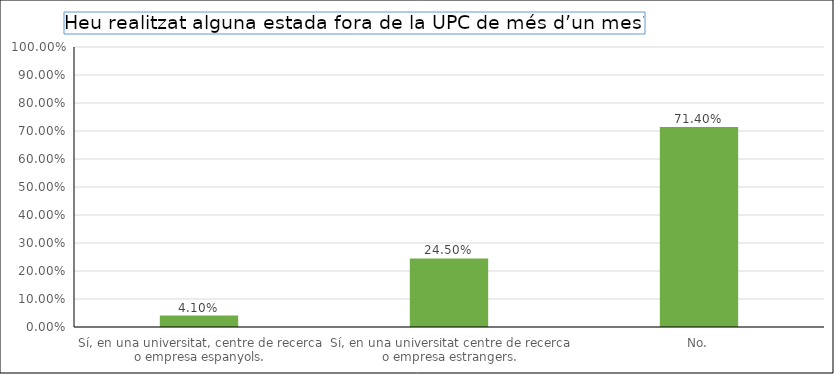
| Category | Series 0 |
|---|---|
| Sí, en una universitat, centre de recerca o empresa espanyols. | 0.041 |
| Sí, en una universitat centre de recerca o empresa estrangers. | 0.245 |
| No. | 0.714 |